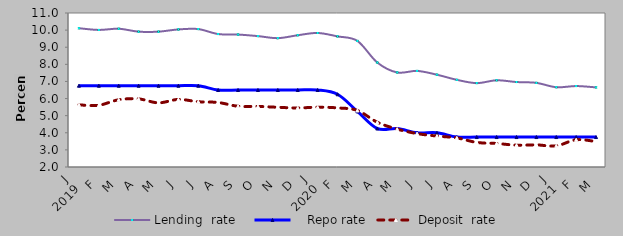
| Category | Lending  rate |    Repo rate | Deposit  rate |
|---|---|---|---|
| 0 | 10.11 | 6.75 | 5.63 |
| 1900-01-01 | 10.01 | 6.75 | 5.61 |
| 1900-01-02 | 10.08 | 6.75 | 5.93 |
| 1900-01-03 | 9.91 | 6.75 | 5.98 |
| 1900-01-04 | 9.91 | 6.75 | 5.75 |
| 1900-01-05 | 10.04 | 6.75 | 5.95 |
| 1900-01-06 | 10.06 | 6.75 | 5.813 |
| 1900-01-07 | 9.77 | 6.5 | 5.77 |
| 1900-01-08 | 9.74 | 6.5 | 5.55 |
| 1900-01-09 | 9.65 | 6.5 | 5.54 |
| 1900-01-10 | 9.53 | 6.5 | 5.49 |
| 1900-01-11 | 9.7 | 6.5 | 5.45 |
| 1900-01-12 | 9.833 | 6.5 | 5.497 |
| 1900-01-13 | 9.634 | 6.25 | 5.454 |
| 1900-01-14 | 9.369 | 5.25 | 5.304 |
| 1900-01-15 | 8.106 | 4.25 | 4.617 |
| 1900-01-16 | 7.526 | 4.25 | 4.216 |
| 1900-01-17 | 7.616 | 4 | 3.953 |
| 1900-01-18 | 7.394 | 4 | 3.809 |
| 1900-01-19 | 7.095 | 3.75 | 3.699 |
| 1900-01-20 | 6.902 | 3.75 | 3.437 |
| 1900-01-21 | 7.067 | 3.75 | 3.374 |
| 1900-01-22 | 6.965 | 3.75 | 3.276 |
| 1900-01-23 | 6.917 | 3.75 | 3.292 |
| 1900-01-24 | 6.663 | 3.75 | 3.236 |
| 1900-01-25 | 6.731 | 3.75 | 3.592 |
| 1900-01-26 | 6.653 | 3.75 | 3.488 |